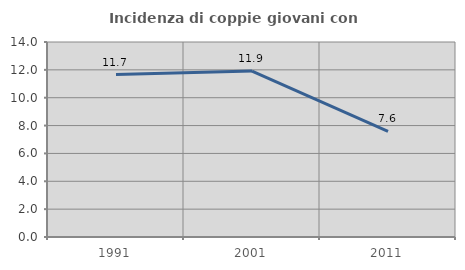
| Category | Incidenza di coppie giovani con figli |
|---|---|
| 1991.0 | 11.667 |
| 2001.0 | 11.917 |
| 2011.0 | 7.589 |